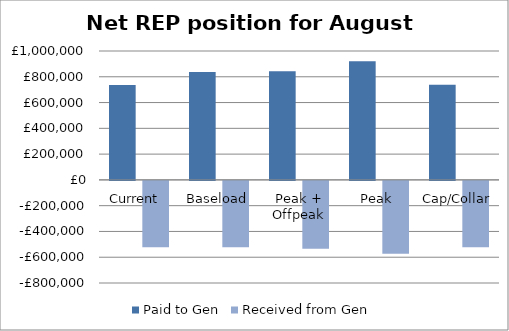
| Category | Paid to Gen | Received from Gen |
|---|---|---|
| Current  | 737164.97 | -514793.85 |
| Baseload | 836899.997 | -514212.364 |
| Peak + Offpeak | 842597.473 | -527402.021 |
| Peak | 920529.542 | -565596.456 |
| Cap/Collar | 737194.094 | -514808.055 |